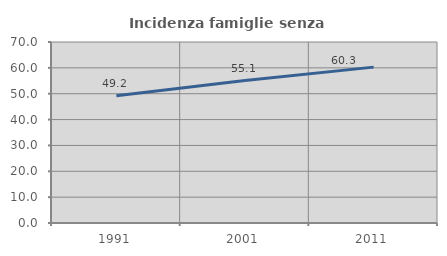
| Category | Incidenza famiglie senza nuclei |
|---|---|
| 1991.0 | 49.195 |
| 2001.0 | 55.075 |
| 2011.0 | 60.28 |